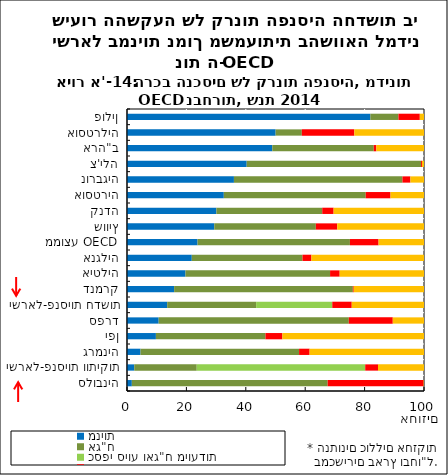
| Category | מניות | אג"ח | כספי סיוע ואג"ח מיועדות | מזומן ופקדונות | אחר |
|---|---|---|---|---|---|
| פולין | 81.943 | 9.45 | 0 | 7.194 | 1.413 |
| אוסטרליה | 50.041 | 8.82 | 0 | 17.673 | 23.466 |
| ארה"ב | 48.925 | 34.156 | 0 | 0.874 | 16.045 |
| צ'ילה | 40.305 | 58.713 | 0 | 0.309 | 0.673 |
| נורבגיה | 36.005 | 56.731 | 0 | 2.687 | 4.577 |
| אוסטריה | 32.597 | 47.78 | 0 | 8.347 | 11.276 |
| קנדה | 30.101 | 35.634 | 0 | 3.832 | 30.433 |
| שוויץ | 29.379 | 34.202 | 0 | 7.201 | 29.218 |
| ממוצע OECD | 23.754 | 51.306 | 0 | 9.645 | 15.295 |
| אנגליה | 21.817 | 37.264 | 0 | 3.013 | 37.905 |
| איטליה | 19.691 | 48.687 | 0 | 3.234 | 28.389 |
| דנמרק | 15.871 | 60.168 | 0 | 0.297 | 23.664 |
| ישראל-פנסיות חדשות | 13.53 | 29.948 | 25.638 | 6.553 | 24.331 |
| ספרד | 10.667 | 64.017 | 0 | 14.804 | 10.513 |
| יפן | 9.734 | 36.883 | 0 | 5.703 | 47.68 |
| גרמניה | 4.542 | 53.394 | 0 | 3.547 | 38.517 |
| ישראל-פנסיות וותיקות | 2.445 | 21.034 | 56.731 | 4.304 | 15.486 |
| סלובניה | 1.632 | 65.933 | 0 | 32.305 | 0.131 |